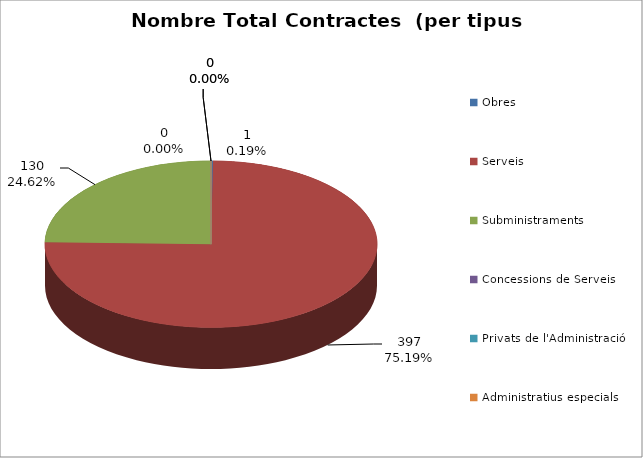
| Category | Nombre Total Contractes |
|---|---|
| Obres | 1 |
| Serveis | 397 |
| Subministraments | 130 |
| Concessions de Serveis | 0 |
| Privats de l'Administració | 0 |
| Administratius especials | 0 |